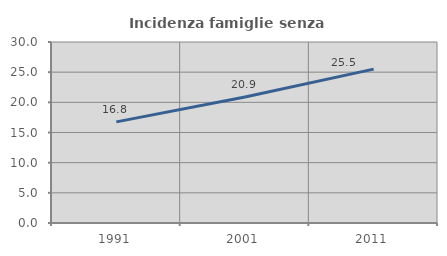
| Category | Incidenza famiglie senza nuclei |
|---|---|
| 1991.0 | 16.762 |
| 2001.0 | 20.899 |
| 2011.0 | 25.505 |